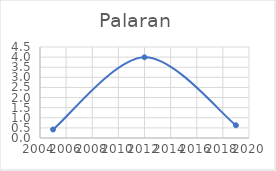
| Category | Series 0 |
|---|---|
| 2005.0 | 0.42 |
| 2012.0 | 3.992 |
| 2019.0 | 0.63 |